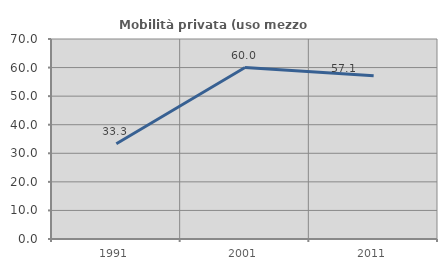
| Category | Mobilità privata (uso mezzo privato) |
|---|---|
| 1991.0 | 33.333 |
| 2001.0 | 60 |
| 2011.0 | 57.143 |